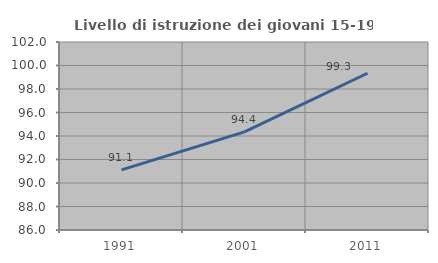
| Category | Livello di istruzione dei giovani 15-19 anni |
|---|---|
| 1991.0 | 91.118 |
| 2001.0 | 94.355 |
| 2011.0 | 99.342 |